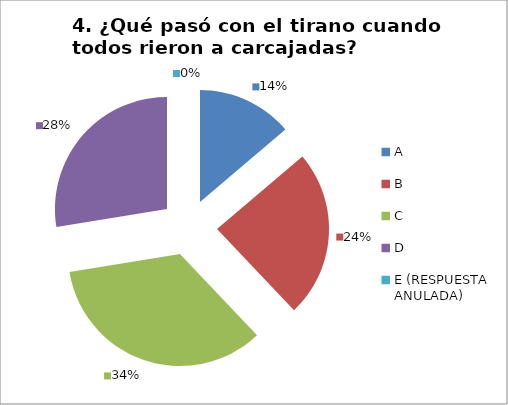
| Category | CANTIDAD DE RESPUESTAS PREGUNTA (4) | PORCENTAJE |
|---|---|---|
| A | 4 | 0.138 |
| B | 7 | 0.241 |
| C | 10 | 0.345 |
| D | 8 | 0.276 |
| E (RESPUESTA ANULADA) | 0 | 0 |